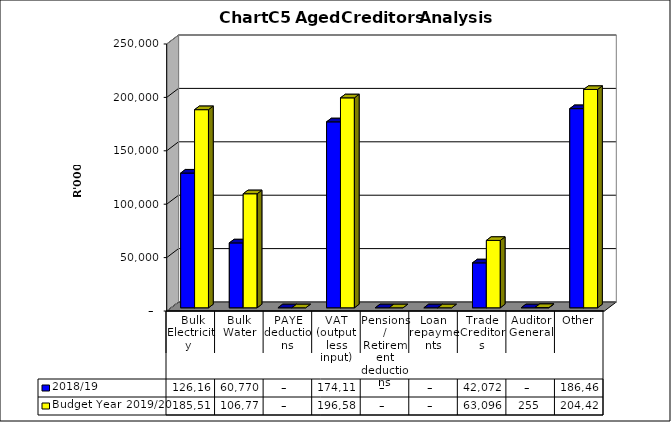
| Category | 2018/19 | Budget Year 2019/20 |
|---|---|---|
|  Bulk Electricity  | 126162410 | 185515179.43 |
| Bulk Water | 60770164 | 106775573.08 |
| PAYE deductions | 0 | 0 |
| VAT (output less input) | 174118638 | 196581271.24 |
| Pensions / Retirement deductions | 0 | 0 |
| Loan repayments | 0 | 0 |
| Trade Creditors | 42072430 | 63096320.66 |
| Auditor General | 0 | 254552.39 |
| Other | 186467958 | 204427142.44 |